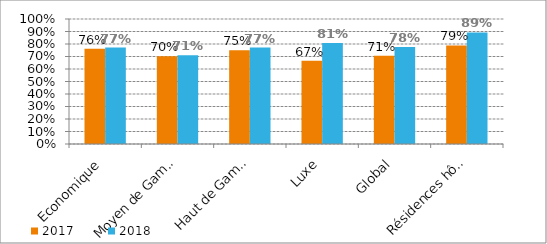
| Category | 2017 | 2018 |
|---|---|---|
| Economique | 0.762 | 0.772 |
| Moyen de Gamme | 0.702 | 0.71 |
| Haut de Gamme | 0.75 | 0.771 |
| Luxe | 0.666 | 0.808 |
| Global | 0.706 | 0.776 |
| Résidences hôtelières | 0.788 | 0.892 |